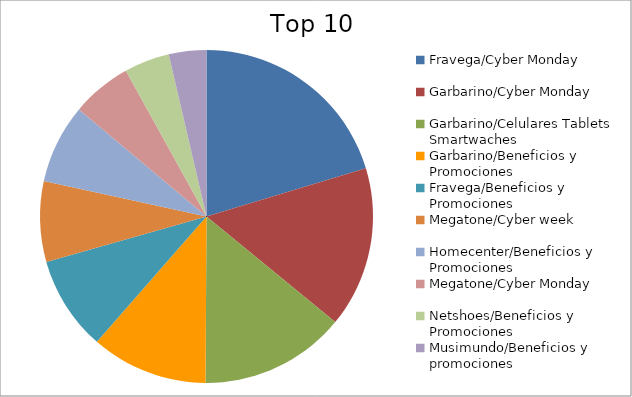
| Category | Series 0 |
|---|---|
| Fravega/Cyber Monday | 13.21 |
| Garbarino/Cyber Monday | 10.14 |
| Garbarino/Celulares Tablets Smartwaches | 9.2 |
| Garbarino/Beneficios y Promociones | 7.37 |
| Fravega/Beneficios y Promociones | 5.96 |
| Megatone/Cyber week | 5.07 |
| Homecenter/Beneficios y Promociones | 5.01 |
| Megatone/Cyber Monday | 3.79 |
| Netshoes/Beneficios y Promociones | 2.86 |
| Musimundo/Beneficios y promociones | 2.37 |